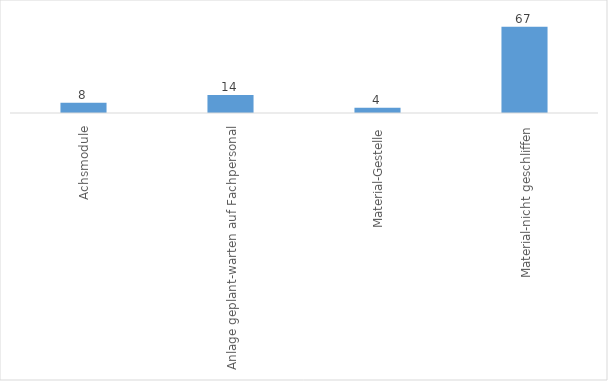
| Category | Series 0 |
|---|---|
| Achsmodule | 8 |
| Anlage geplant-warten auf Fachpersonal | 14 |
| Material-Gestelle | 4 |
| Material-nicht geschliffen | 67 |